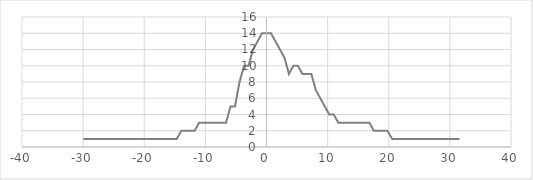
| Category | count |
|---|---|
| -30.0 | 1 |
| -29.283333333333335 | 1 |
| -28.583333333333336 | 1 |
| -27.866666666666667 | 1 |
| -27.150000000000002 | 1 |
| -26.433333333333334 | 1 |
| -25.71666666666667 | 1 |
| -25.0 | 1 |
| -24.283333333333335 | 1 |
| -23.56666666666667 | 1 |
| -22.866666666666667 | 1 |
| -22.15 | 1 |
| -21.433333333333337 | 1 |
| -20.71666666666667 | 1 |
| -20.0 | 1 |
| -15.416666666666664 | 1 |
| -14.683333333333337 | 1 |
| -13.950000000000003 | 2 |
| -13.216666666666669 | 2 |
| -12.483333333333334 | 2 |
| -11.75 | 2 |
| -11.016666666666666 | 3 |
| -10.283333333333331 | 3 |
| -9.550000000000004 | 3 |
| -8.81666666666667 | 3 |
| -8.083333333333336 | 3 |
| -7.350000000000001 | 3 |
| -6.616666666666667 | 3 |
| -5.883333333333333 | 5 |
| -5.149999999999999 | 5 |
| -4.416666666666664 | 8 |
| -3.666666666666667 | 10 |
| -2.9333333333333336 | 10 |
| -2.2 | 12 |
| -1.4666666666666668 | 13 |
| -0.7333333333333334 | 14 |
| 0.0 | 14 |
| 0.7333333333333334 | 14 |
| 1.4666666666666668 | 13 |
| 2.2 | 12 |
| 2.9333333333333336 | 11 |
| 3.666666666666666 | 9 |
| 4.3999999999999995 | 10 |
| 5.133333333333334 | 10 |
| 5.866666666666666 | 9 |
| 6.6000000000000005 | 9 |
| 7.333333333333333 | 9 |
| 8.066666666666663 | 7 |
| 8.799999999999997 | 6 |
| 9.533333333333331 | 5 |
| 10.266666666666666 | 4 |
| 11.0 | 4 |
| 11.733333333333334 | 3 |
| 12.466666666666669 | 3 |
| 13.166666666666671 | 3 |
| 13.899999999999999 | 3 |
| 14.633333333333333 | 3 |
| 15.366666666666667 | 3 |
| 16.1 | 3 |
| 16.833333333333336 | 3 |
| 17.56666666666667 | 2 |
| 18.300000000000004 | 2 |
| 19.03333333333333 | 2 |
| 19.766666666666666 | 2 |
| 20.566666666666663 | 1 |
| 21.299999999999997 | 1 |
| 22.03333333333333 | 1 |
| 22.766666666666666 | 1 |
| 23.5 | 1 |
| 24.25 | 1 |
| 24.983333333333334 | 1 |
| 25.700000000000003 | 1 |
| 26.433333333333337 | 1 |
| 27.166666666666657 | 1 |
| 27.916666666666657 | 1 |
| 28.64999999999999 | 1 |
| 29.383333333333326 | 1 |
| 30.11666666666666 | 1 |
| 30.849999999999994 | 1 |
| 31.58333333333333 | 1 |